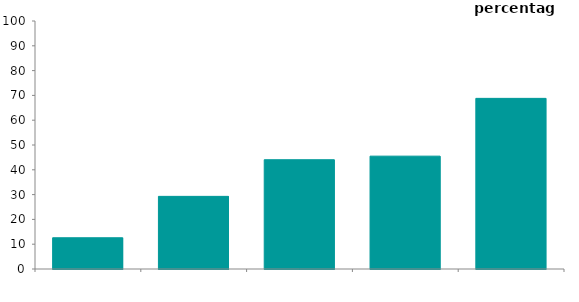
| Category | social renters |
|---|---|
| first quintile (lowest incomes) | 12.595 |
| second quintile | 29.285 |
| third quintile | 44.063 |
| fourth quintile | 45.505 |
| fifth quintile (highest incomes) | 68.801 |